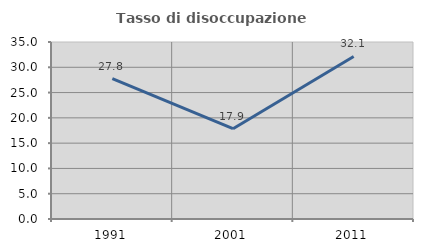
| Category | Tasso di disoccupazione giovanile  |
|---|---|
| 1991.0 | 27.778 |
| 2001.0 | 17.857 |
| 2011.0 | 32.143 |